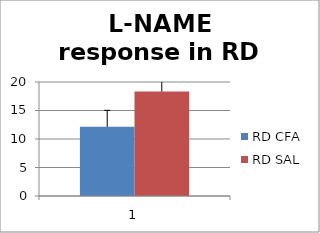
| Category | RD CFA | RD SAL |
|---|---|---|
| 0 | 12.13 | 18.327 |